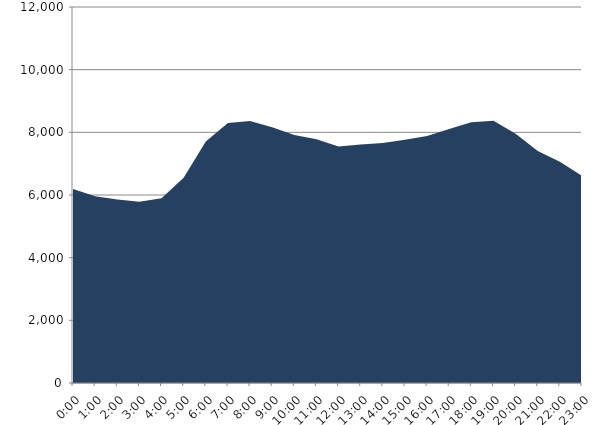
| Category | Series 0 | Series 1 |
|---|---|---|
| 2023-09-20 |  | 6191.179 |
| 2023-09-20 01:00:00 |  | 5958.528 |
| 2023-09-20 02:00:00 |  | 5858.434 |
| 2023-09-20 03:00:00 |  | 5784.831 |
| 2023-09-20 04:00:00 |  | 5892.736 |
| 2023-09-20 05:00:00 |  | 6548.867 |
| 2023-09-20 06:00:00 |  | 7709.084 |
| 2023-09-20 07:00:00 |  | 8294.6 |
| 2023-09-20 08:00:00 |  | 8359.747 |
| 2023-09-20 09:00:00 |  | 8163.501 |
| 2023-09-20 10:00:00 |  | 7917.984 |
| 2023-09-20 11:00:00 |  | 7782.43 |
| 2023-09-20 12:00:00 |  | 7547.761 |
| 2023-09-20 13:00:00 |  | 7612.004 |
| 2023-09-20 14:00:00 |  | 7655.755 |
| 2023-09-20 15:00:00 |  | 7765.169 |
| 2023-09-20 16:00:00 |  | 7882.762 |
| 2023-09-20 17:00:00 |  | 8106.93 |
| 2023-09-20 18:00:00 |  | 8322.618 |
| 2023-09-20 19:00:00 |  | 8370.807 |
| 2023-09-20 20:00:00 |  | 7951.488 |
| 2023-09-20 21:00:00 |  | 7406.051 |
| 2023-09-20 22:00:00 |  | 7058.63 |
| 2023-09-20 23:00:00 |  | 6607.248 |